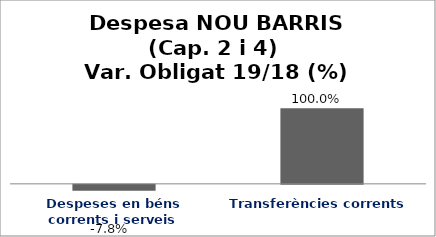
| Category | Series 0 |
|---|---|
| Despeses en béns corrents i serveis | -0.078 |
| Transferències corrents | 1 |